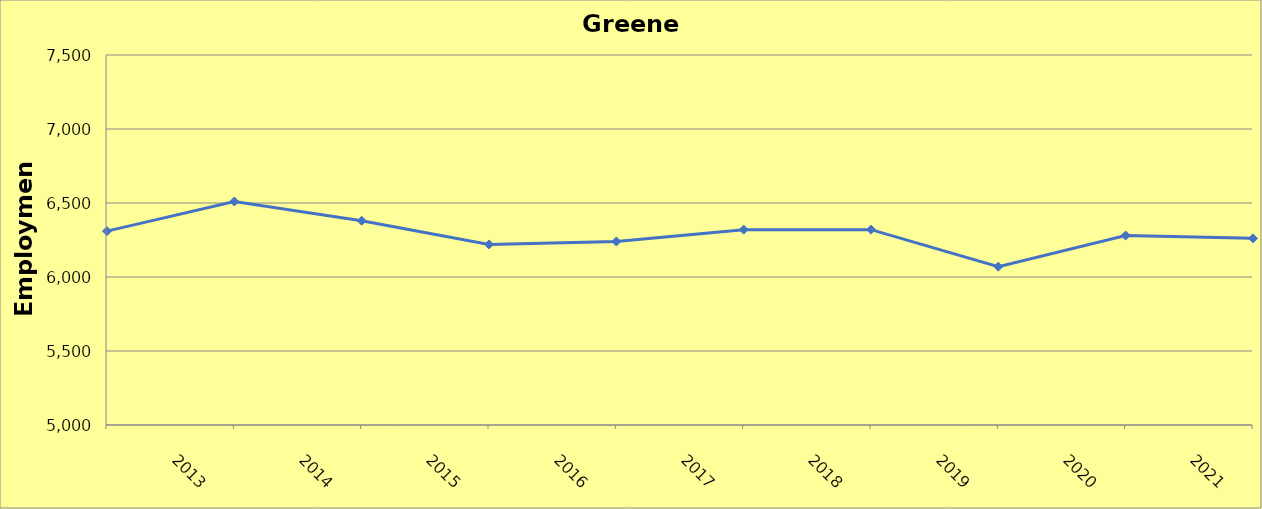
| Category | Greene County |
|---|---|
| 2013.0 | 6310 |
| 2014.0 | 6510 |
| 2015.0 | 6380 |
| 2016.0 | 6220 |
| 2017.0 | 6240 |
| 2018.0 | 6320 |
| 2019.0 | 6320 |
| 2020.0 | 6070 |
| 2021.0 | 6280 |
| 2022.0 | 6261 |